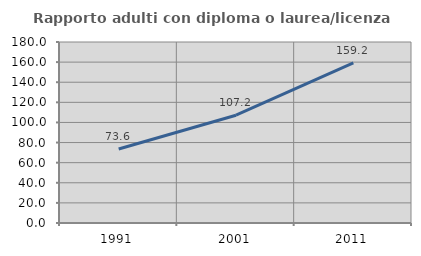
| Category | Rapporto adulti con diploma o laurea/licenza media  |
|---|---|
| 1991.0 | 73.58 |
| 2001.0 | 107.188 |
| 2011.0 | 159.229 |